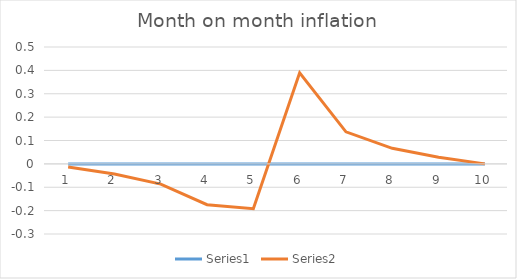
| Category | Series 0 | Series 1 |
|---|---|---|
| 0 | 0 | -0.014 |
| 1 | 0 | -0.044 |
| 2 | 0 | -0.087 |
| 3 | 0 | -0.175 |
| 4 | 0 | -0.192 |
| 5 | 0 | 0.39 |
| 6 | 0 | 0.137 |
| 7 | 0 | 0.067 |
| 8 | 0 | 0.028 |
| 9 | 0 | 0 |